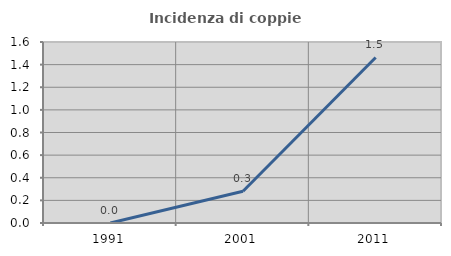
| Category | Incidenza di coppie miste |
|---|---|
| 1991.0 | 0 |
| 2001.0 | 0.281 |
| 2011.0 | 1.463 |